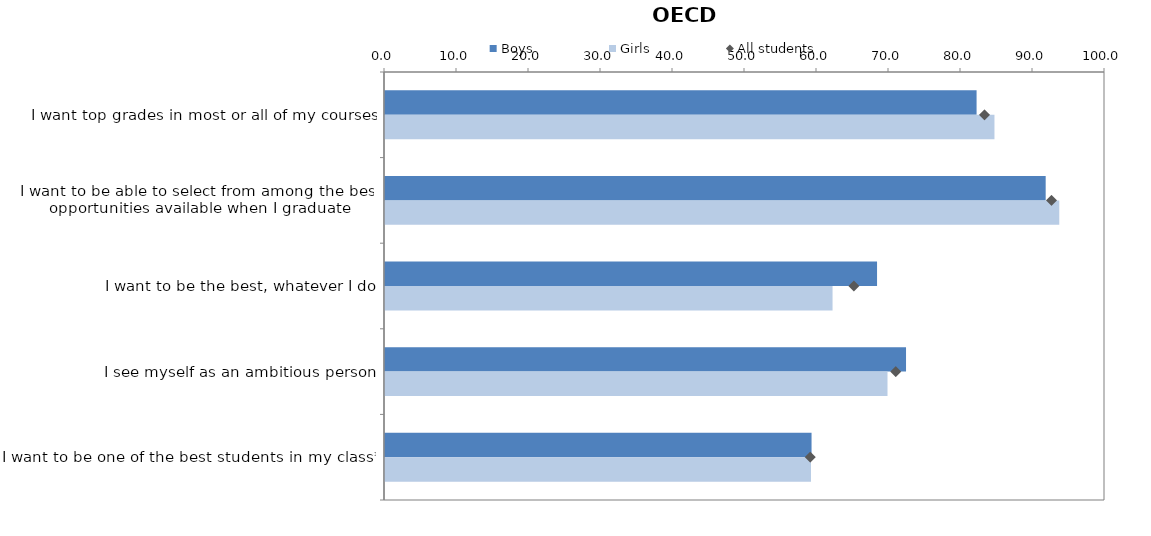
| Category | Boys | Girls |
|---|---|---|
| I want top grades in most or all of my courses | 82.164 | 84.648 |
| I want to be able to select from among the best opportunities available when I graduate | 91.761 | 93.65 |
| I want to be the best, whatever I do | 68.34 | 62.16 |
| I see myself as an ambitious person | 72.365 | 69.791 |
| I want to be one of the best students in my class* | 59.243 | 59.164 |